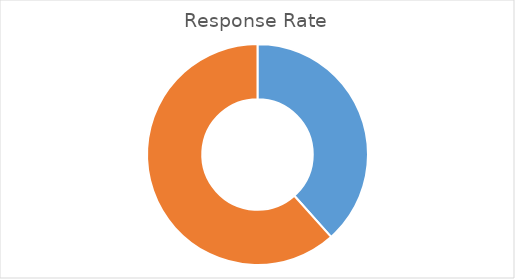
| Category | Total |
|---|---|
| Sum of OverallRespRate | 38.405 |
| Sum of OverallNonRespRate | 61.595 |